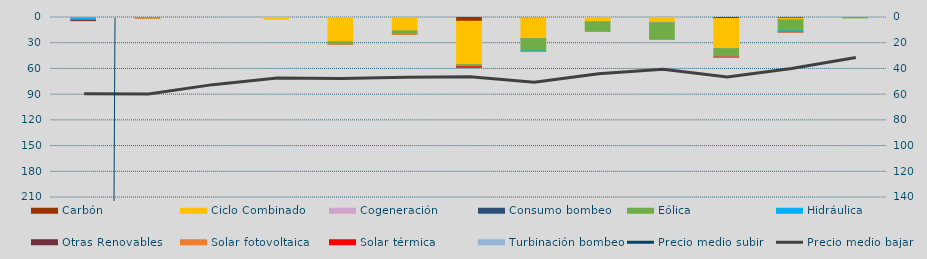
| Category | Carbón | Ciclo Combinado | Cogeneración | Consumo bombeo | Eólica | Hidráulica | Otras Renovables | Solar fotovoltaica | Solar térmica | Turbinación bombeo |
|---|---|---|---|---|---|---|---|---|---|---|
| 0 | 0 | 0 | 524.1 |  | 0 | 2473.2 | 672 | 0 | 0 | 0 |
| 1 | 0 | 0 | 0 |  | 757.3 | 0 | 0 | 12.2 | 0 | 0 |
| 2 | 0 | 0 | 0 |  | 0 | 0 | 0 | 0 | 0 | 0 |
| 3 | 0 | 2002 | 0 |  | 0 | 0 | 0 | 0 | 0 | 0 |
| 4 | 0 | 28154.5 | 304 |  | 2598.1 | 70.2 | 0 | 87.1 | 0 | 0 |
| 5 | 0 | 15599.6 | 0 |  | 3217.5 | 555 | 0 | 406.6 | 0 | 0 |
| 6 | 4394.5 | 50553 | 0 |  | 2251 | 0 | 467 | 33.2 | 196 | 0 |
| 7 | 167 | 24469.7 | 4.5 |  | 14472.2 | 627.8 | 0 | 21.8 | 0 | 0 |
| 8 | 0 | 4989.5 | 0 |  | 11218.3 | 8.9 | 0 | 0 | 0 | 0 |
| 9 | 0 | 5246.6 | 891.5 |  | 19357.7 | 73 | 0 | 0 | 0 | 0 |
| 10 | 1161 | 34847 | 340.9 |  | 9473.4 | 120 | 0 | 21.4 | 39.8 | 400 |
| 11 | 846 | 1898.8 | 0 |  | 12932.4 | 1173 | 80 | 33 | 0 | 0 |
| 12 | 0 | 0 | 0 |  | 464.6 | 0 | 0 | 0 | 0 | 0 |